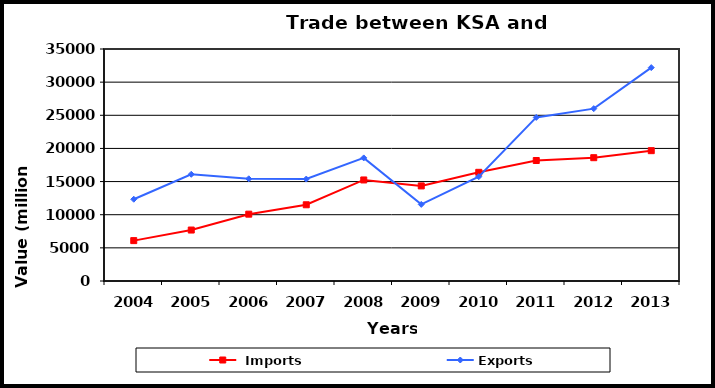
| Category |  Imports | Exports |
|---|---|---|
| 2004.0 | 6092 | 12335 |
| 2005.0 | 7687 | 16102 |
| 2006.0 | 10082 | 15420 |
| 2007.0 | 11499 | 15380 |
| 2008.0 | 15244 | 18568 |
| 2009.0 | 14346 | 11557 |
| 2010.0 | 16395 | 15739 |
| 2011.0 | 18178 | 24679 |
| 2012.0 | 18603 | 26002 |
| 2013.0 | 19663 | 32191 |